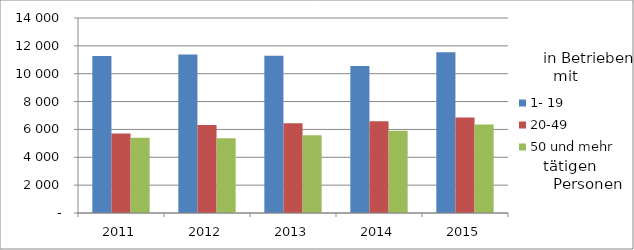
| Category | 1- 19 | 20-49 | 50 und mehr |
|---|---|---|---|
| 2011.0 | 11279 | 5713 | 5395 |
| 2012.0 | 11384 | 6312 | 5358 |
| 2013.0 | 11284 | 6435 | 5582 |
| 2014.0 | 10551 | 6588 | 5913 |
| 2015.0 | 11550 | 6857 | 6353 |